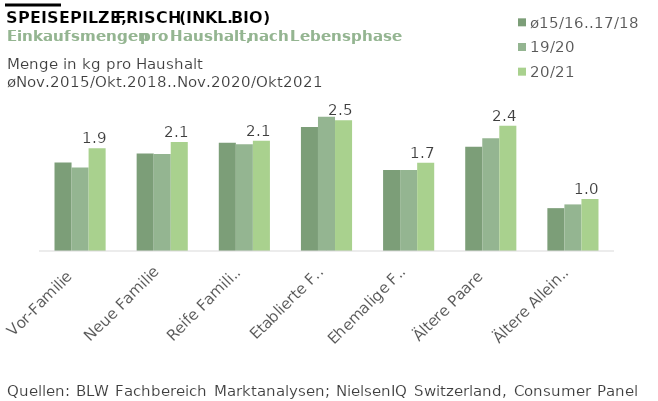
| Category | ø15/16..17/18 | 19/20 | 20/21 |
|---|---|---|---|
| Vor-Familie | 1.67 | 1.574 | 1.937 |
| Neue Familie | 1.84 | 1.832 | 2.057 |
| Reife Familien | 2.043 | 2.013 | 2.082 |
| Etablierte Familie | 2.341 | 2.532 | 2.467 |
| Ehemalige Familie | 1.53 | 1.53 | 1.666 |
| Ältere Paare | 1.967 | 2.125 | 2.364 |
| Ältere Alleinstehende | 0.809 | 0.879 | 0.98 |